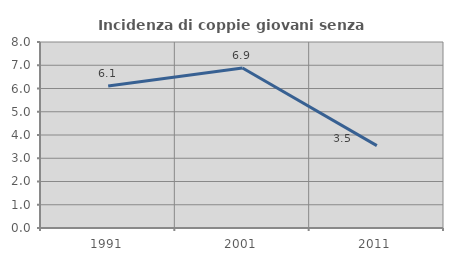
| Category | Incidenza di coppie giovani senza figli |
|---|---|
| 1991.0 | 6.108 |
| 2001.0 | 6.88 |
| 2011.0 | 3.543 |